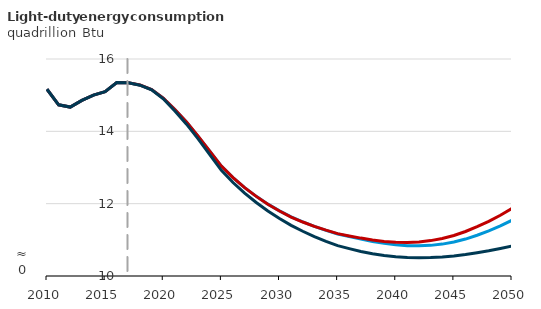
| Category | Autonomous battery electric vehicle | Autonomous hybrid electric vehicle  | Reference |
|---|---|---|---|
| 2010.0 | 15.163 | 15.163 | 15.163 |
| 2011.0 | 14.733 | 14.733 | 14.733 |
| 2012.0 | 14.671 | 14.671 | 14.671 |
| 2013.0 | 14.857 | 14.857 | 14.857 |
| 2014.0 | 15.003 | 15.003 | 15.003 |
| 2015.0 | 15.097 | 15.097 | 15.097 |
| 2016.0 | 15.349 | 15.349 | 15.349 |
| 2017.0 | 15.342 | 15.342 | 15.341 |
| 2018.0 | 15.279 | 15.279 | 15.276 |
| 2019.0 | 15.153 | 15.153 | 15.15 |
| 2020.0 | 14.918 | 14.919 | 14.899 |
| 2021.0 | 14.602 | 14.601 | 14.562 |
| 2022.0 | 14.261 | 14.262 | 14.198 |
| 2023.0 | 13.861 | 13.863 | 13.79 |
| 2024.0 | 13.448 | 13.45 | 13.354 |
| 2025.0 | 13.039 | 13.04 | 12.923 |
| 2026.0 | 12.72 | 12.72 | 12.584 |
| 2027.0 | 12.443 | 12.443 | 12.291 |
| 2028.0 | 12.202 | 12.201 | 12.033 |
| 2029.0 | 11.987 | 11.985 | 11.799 |
| 2030.0 | 11.8 | 11.796 | 11.591 |
| 2031.0 | 11.633 | 11.63 | 11.401 |
| 2032.0 | 11.495 | 11.493 | 11.237 |
| 2033.0 | 11.372 | 11.373 | 11.09 |
| 2034.0 | 11.262 | 11.267 | 10.958 |
| 2035.0 | 11.161 | 11.172 | 10.839 |
| 2036.0 | 11.09 | 11.108 | 10.757 |
| 2037.0 | 11.02 | 11.048 | 10.68 |
| 2038.0 | 10.955 | 10.996 | 10.616 |
| 2039.0 | 10.903 | 10.957 | 10.568 |
| 2040.0 | 10.864 | 10.935 | 10.535 |
| 2041.0 | 10.839 | 10.928 | 10.513 |
| 2042.0 | 10.833 | 10.943 | 10.506 |
| 2043.0 | 10.847 | 10.979 | 10.509 |
| 2044.0 | 10.882 | 11.038 | 10.525 |
| 2045.0 | 10.938 | 11.121 | 10.552 |
| 2046.0 | 11.021 | 11.231 | 10.592 |
| 2047.0 | 11.126 | 11.364 | 10.643 |
| 2048.0 | 11.245 | 11.513 | 10.698 |
| 2049.0 | 11.384 | 11.681 | 10.76 |
| 2050.0 | 11.542 | 11.869 | 10.829 |